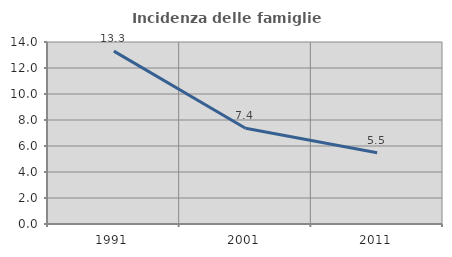
| Category | Incidenza delle famiglie numerose |
|---|---|
| 1991.0 | 13.299 |
| 2001.0 | 7.364 |
| 2011.0 | 5.487 |